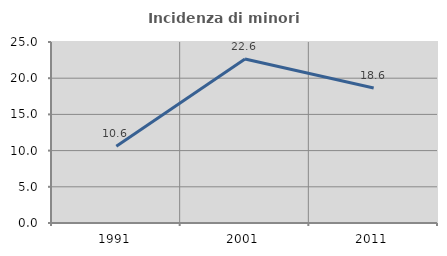
| Category | Incidenza di minori stranieri |
|---|---|
| 1991.0 | 10.586 |
| 2001.0 | 22.64 |
| 2011.0 | 18.649 |